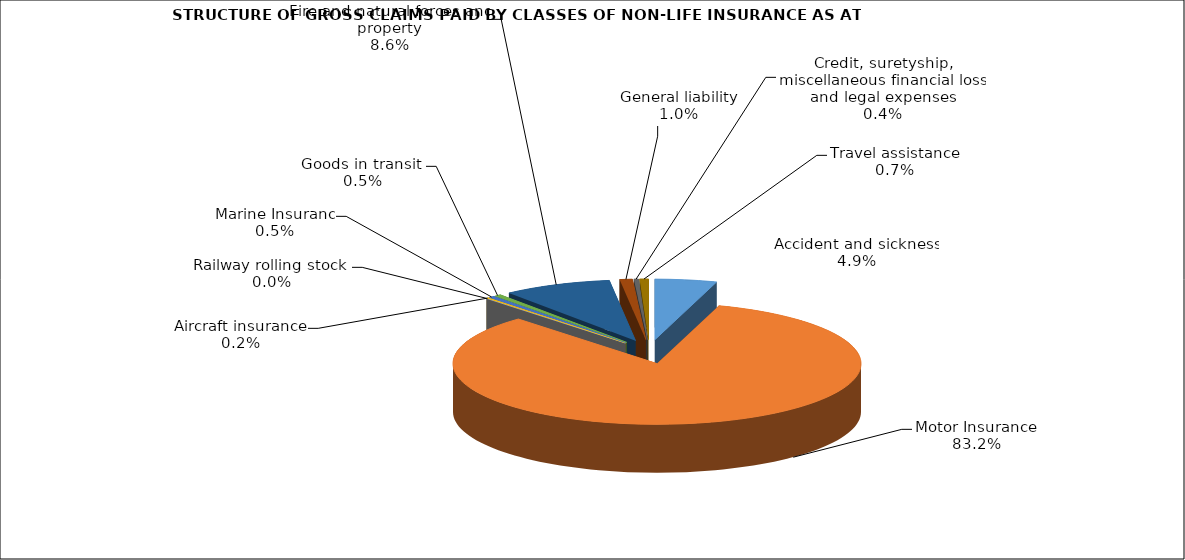
| Category | Accident and sickness |
|---|---|
| Accident and sickness | 0.049 |
| Motor Insurance | 0.832 |
| Railway rolling stock  | 0 |
| Aircraft insurance | 0.002 |
| Marine Insuranc | 0.005 |
| Goods in transit  | 0.005 |
| Fire and natural forces and property | 0.086 |
| General liability | 0.01 |
| Credit, suretyship, miscellaneous financial loss and legal expenses | 0.004 |
| Travel assistance | 0.007 |